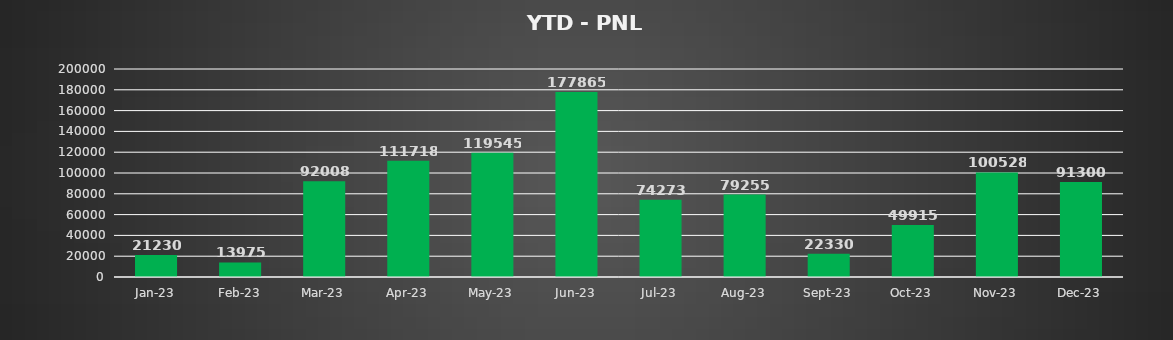
| Category | Series 1 |
|---|---|
| 2023-01-01 | 21230 |
| 2023-02-01 | 13975 |
| 2023-03-01 | 92007.5 |
| 2023-04-01 | 111717.5 |
| 2023-05-01 | 119545 |
| 2023-06-01 | 177865 |
| 2023-07-01 | 74272.5 |
| 2023-08-01 | 79255 |
| 2023-09-01 | 22330.2 |
| 2023-10-01 | 49915 |
| 2023-11-01 | 100527.5 |
| 2023-12-01 | 91300 |